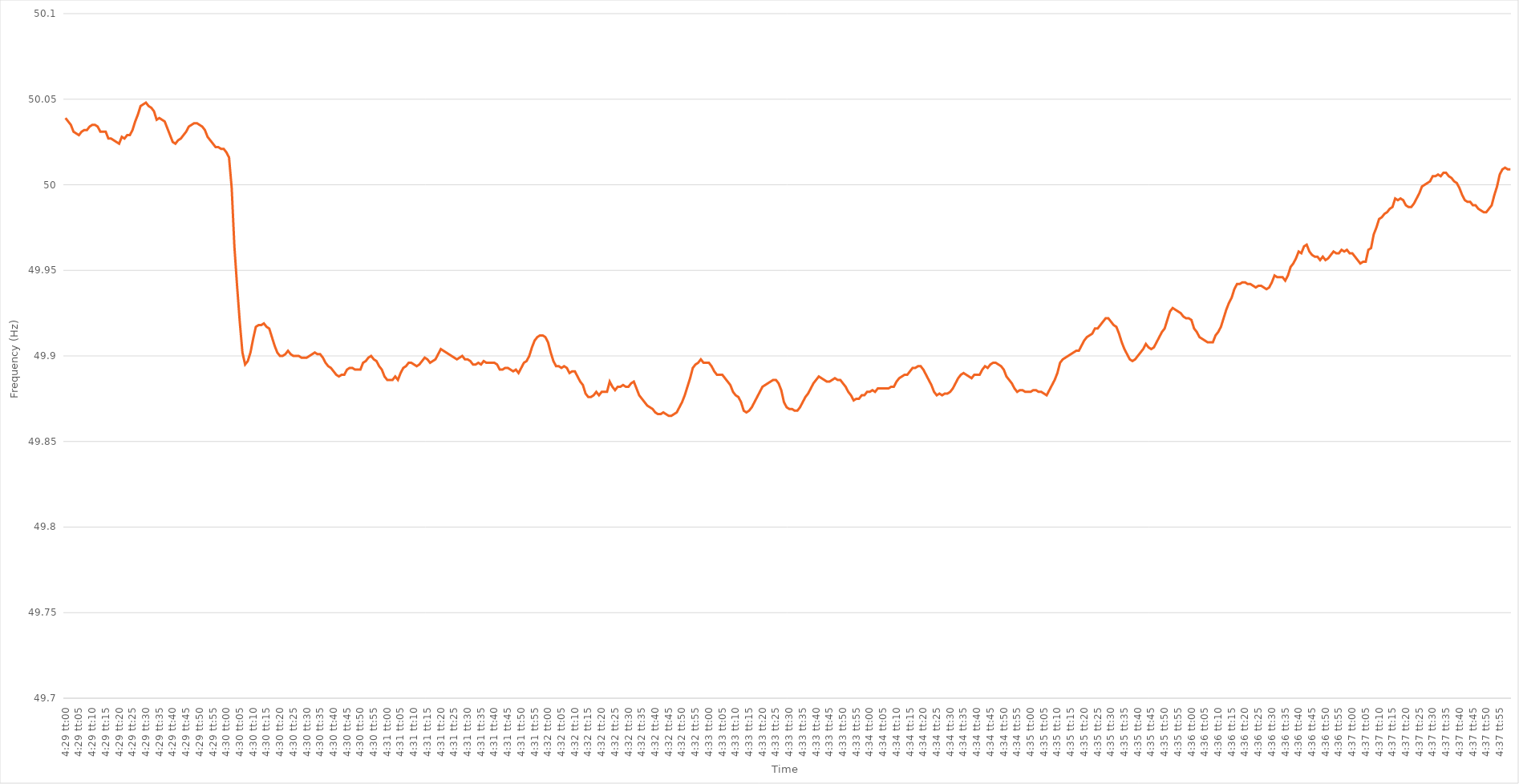
| Category | Series 0 |
|---|---|
| 0.18680555555555556 | 50.039 |
| 0.18681712962962962 | 50.037 |
| 0.18682870370370372 | 50.035 |
| 0.18684027777777779 | 50.031 |
| 0.18685185185185185 | 50.03 |
| 0.18686342592592595 | 50.029 |
| 0.186875 | 50.031 |
| 0.18688657407407408 | 50.032 |
| 0.18689814814814817 | 50.032 |
| 0.1869097222222222 | 50.034 |
| 0.18692129629629628 | 50.035 |
| 0.18693287037037035 | 50.035 |
| 0.18694444444444444 | 50.034 |
| 0.1869560185185185 | 50.031 |
| 0.18696759259259257 | 50.031 |
| 0.18697916666666667 | 50.031 |
| 0.18699074074074074 | 50.027 |
| 0.1870023148148148 | 50.027 |
| 0.1870138888888889 | 50.026 |
| 0.18702546296296296 | 50.025 |
| 0.18703703703703703 | 50.024 |
| 0.18704861111111112 | 50.028 |
| 0.1870601851851852 | 50.027 |
| 0.18707175925925926 | 50.029 |
| 0.18708333333333335 | 50.029 |
| 0.18709490740740742 | 50.032 |
| 0.18710648148148148 | 50.037 |
| 0.18711805555555558 | 50.041 |
| 0.18712962962962965 | 50.046 |
| 0.1871412037037037 | 50.047 |
| 0.18715277777777775 | 50.048 |
| 0.18716435185185185 | 50.046 |
| 0.1871759259259259 | 50.045 |
| 0.18718749999999998 | 50.043 |
| 0.18719907407407407 | 50.038 |
| 0.18721064814814814 | 50.039 |
| 0.1872222222222222 | 50.038 |
| 0.1872337962962963 | 50.037 |
| 0.18724537037037037 | 50.033 |
| 0.18725694444444443 | 50.029 |
| 0.18726851851851853 | 50.025 |
| 0.1872800925925926 | 50.024 |
| 0.18729166666666666 | 50.026 |
| 0.18730324074074076 | 50.027 |
| 0.18731481481481482 | 50.029 |
| 0.1873263888888889 | 50.031 |
| 0.18733796296296298 | 50.034 |
| 0.18734953703703705 | 50.035 |
| 0.18736111111111112 | 50.036 |
| 0.1873726851851852 | 50.036 |
| 0.18738425925925925 | 50.035 |
| 0.18739583333333332 | 50.034 |
| 0.18740740740740738 | 50.032 |
| 0.18741898148148148 | 50.028 |
| 0.18743055555555554 | 50.026 |
| 0.1874421296296296 | 50.024 |
| 0.1874537037037037 | 50.022 |
| 0.18746527777777777 | 50.022 |
| 0.18747685185185184 | 50.021 |
| 0.18748842592592593 | 50.021 |
| 0.1875 | 50.019 |
| 0.18751157407407407 | 50.016 |
| 0.18752314814814816 | 49.998 |
| 0.18753472222222223 | 49.964 |
| 0.1875462962962963 | 49.941 |
| 0.1875578703703704 | 49.92 |
| 0.18756944444444446 | 49.902 |
| 0.18758101851851852 | 49.895 |
| 0.18759259259259262 | 49.897 |
| 0.18760416666666666 | 49.902 |
| 0.18761574074074075 | 49.91 |
| 0.1876273148148148 | 49.917 |
| 0.18763888888888888 | 49.918 |
| 0.18765046296296295 | 49.918 |
| 0.18766203703703702 | 49.919 |
| 0.1876736111111111 | 49.917 |
| 0.18768518518518518 | 49.916 |
| 0.18769675925925924 | 49.911 |
| 0.18770833333333334 | 49.906 |
| 0.1877199074074074 | 49.902 |
| 0.18773148148148147 | 49.9 |
| 0.18774305555555557 | 49.9 |
| 0.18775462962962963 | 49.901 |
| 0.1877662037037037 | 49.903 |
| 0.1877777777777778 | 49.901 |
| 0.18778935185185186 | 49.9 |
| 0.18780092592592593 | 49.9 |
| 0.18781250000000002 | 49.9 |
| 0.1878240740740741 | 49.899 |
| 0.18783564814814815 | 49.899 |
| 0.1878472222222222 | 49.899 |
| 0.18785879629629632 | 49.9 |
| 0.18787037037037035 | 49.901 |
| 0.18788194444444442 | 49.902 |
| 0.18789351851851852 | 49.901 |
| 0.18790509259259258 | 49.901 |
| 0.18791666666666665 | 49.899 |
| 0.18792824074074074 | 49.896 |
| 0.1879398148148148 | 49.894 |
| 0.18795138888888888 | 49.893 |
| 0.18796296296296297 | 49.891 |
| 0.18797453703703704 | 49.889 |
| 0.1879861111111111 | 49.888 |
| 0.1879976851851852 | 49.889 |
| 0.18800925925925926 | 49.889 |
| 0.18802083333333333 | 49.892 |
| 0.18803240740740743 | 49.893 |
| 0.1880439814814815 | 49.893 |
| 0.18805555555555556 | 49.892 |
| 0.18806712962962965 | 49.892 |
| 0.18807870370370372 | 49.892 |
| 0.18809027777777776 | 49.896 |
| 0.18810185185185188 | 49.897 |
| 0.18811342592592592 | 49.899 |
| 0.188125 | 49.9 |
| 0.18813657407407405 | 49.898 |
| 0.18814814814814815 | 49.897 |
| 0.18815972222222221 | 49.894 |
| 0.18817129629629628 | 49.892 |
| 0.18818287037037038 | 49.888 |
| 0.18819444444444444 | 49.886 |
| 0.1882060185185185 | 49.886 |
| 0.1882175925925926 | 49.886 |
| 0.18822916666666667 | 49.888 |
| 0.18824074074074074 | 49.886 |
| 0.18825231481481483 | 49.89 |
| 0.1882638888888889 | 49.893 |
| 0.18827546296296296 | 49.894 |
| 0.18828703703703706 | 49.896 |
| 0.18829861111111112 | 49.896 |
| 0.1883101851851852 | 49.895 |
| 0.18832175925925929 | 49.894 |
| 0.18833333333333332 | 49.895 |
| 0.1883449074074074 | 49.897 |
| 0.18835648148148146 | 49.899 |
| 0.18836805555555555 | 49.898 |
| 0.18837962962962962 | 49.896 |
| 0.18839120370370369 | 49.897 |
| 0.18840277777777778 | 49.898 |
| 0.18841435185185185 | 49.901 |
| 0.1884259259259259 | 49.904 |
| 0.1884375 | 49.903 |
| 0.18844907407407407 | 49.902 |
| 0.18846064814814814 | 49.901 |
| 0.18847222222222224 | 49.9 |
| 0.1884837962962963 | 49.899 |
| 0.18849537037037037 | 49.898 |
| 0.18850694444444446 | 49.899 |
| 0.18851851851851853 | 49.9 |
| 0.1885300925925926 | 49.898 |
| 0.1885416666666667 | 49.898 |
| 0.18855324074074073 | 49.897 |
| 0.18856481481481482 | 49.895 |
| 0.18857638888888886 | 49.895 |
| 0.18858796296296296 | 49.896 |
| 0.18859953703703702 | 49.895 |
| 0.1886111111111111 | 49.897 |
| 0.18862268518518518 | 49.896 |
| 0.18863425925925925 | 49.896 |
| 0.18864583333333332 | 49.896 |
| 0.1886574074074074 | 49.896 |
| 0.18866898148148148 | 49.895 |
| 0.18868055555555555 | 49.892 |
| 0.18869212962962964 | 49.892 |
| 0.1887037037037037 | 49.893 |
| 0.18871527777777777 | 49.893 |
| 0.18872685185185187 | 49.892 |
| 0.18873842592592593 | 49.891 |
| 0.18875 | 49.892 |
| 0.1887615740740741 | 49.89 |
| 0.18877314814814816 | 49.893 |
| 0.18878472222222223 | 49.896 |
| 0.18879629629629627 | 49.897 |
| 0.1888078703703704 | 49.9 |
| 0.18881944444444443 | 49.905 |
| 0.1888310185185185 | 49.909 |
| 0.1888425925925926 | 49.911 |
| 0.18885416666666666 | 49.912 |
| 0.18886574074074072 | 49.912 |
| 0.18887731481481482 | 49.911 |
| 0.18888888888888888 | 49.908 |
| 0.18890046296296295 | 49.902 |
| 0.18891203703703704 | 49.897 |
| 0.1889236111111111 | 49.894 |
| 0.18893518518518518 | 49.894 |
| 0.18894675925925927 | 49.893 |
| 0.18895833333333334 | 49.894 |
| 0.1889699074074074 | 49.893 |
| 0.1889814814814815 | 49.89 |
| 0.18899305555555557 | 49.891 |
| 0.18900462962962963 | 49.891 |
| 0.18901620370370367 | 49.888 |
| 0.1890277777777778 | 49.885 |
| 0.18903935185185183 | 49.883 |
| 0.18905092592592596 | 49.878 |
| 0.1890625 | 49.876 |
| 0.18907407407407406 | 49.876 |
| 0.18908564814814813 | 49.877 |
| 0.18909722222222222 | 49.879 |
| 0.1891087962962963 | 49.877 |
| 0.18912037037037036 | 49.879 |
| 0.18913194444444445 | 49.879 |
| 0.18914351851851852 | 49.879 |
| 0.18915509259259258 | 49.885 |
| 0.18916666666666668 | 49.882 |
| 0.18917824074074074 | 49.88 |
| 0.1891898148148148 | 49.882 |
| 0.1892013888888889 | 49.882 |
| 0.18921296296296297 | 49.883 |
| 0.18922453703703704 | 49.882 |
| 0.18923611111111113 | 49.882 |
| 0.1892476851851852 | 49.884 |
| 0.18925925925925924 | 49.885 |
| 0.18927083333333336 | 49.881 |
| 0.1892824074074074 | 49.877 |
| 0.1892939814814815 | 49.875 |
| 0.18930555555555553 | 49.873 |
| 0.18931712962962963 | 49.871 |
| 0.1893287037037037 | 49.87 |
| 0.18934027777777776 | 49.869 |
| 0.18935185185185185 | 49.867 |
| 0.18936342592592592 | 49.866 |
| 0.189375 | 49.866 |
| 0.18938657407407408 | 49.867 |
| 0.18939814814814815 | 49.866 |
| 0.18940972222222222 | 49.865 |
| 0.1894212962962963 | 49.865 |
| 0.18943287037037038 | 49.866 |
| 0.18944444444444444 | 49.867 |
| 0.18945601851851854 | 49.87 |
| 0.1894675925925926 | 49.873 |
| 0.18947916666666667 | 49.877 |
| 0.18949074074074077 | 49.882 |
| 0.1895023148148148 | 49.887 |
| 0.1895138888888889 | 49.893 |
| 0.18952546296296294 | 49.895 |
| 0.18953703703703703 | 49.896 |
| 0.1895486111111111 | 49.898 |
| 0.18956018518518516 | 49.896 |
| 0.18957175925925926 | 49.896 |
| 0.18958333333333333 | 49.896 |
| 0.1895949074074074 | 49.894 |
| 0.1896064814814815 | 49.891 |
| 0.18961805555555555 | 49.889 |
| 0.18962962962962962 | 49.889 |
| 0.18964120370370371 | 49.889 |
| 0.18965277777777778 | 49.887 |
| 0.18966435185185185 | 49.885 |
| 0.18967592592592594 | 49.883 |
| 0.1896875 | 49.879 |
| 0.18969907407407408 | 49.877 |
| 0.18971064814814817 | 49.876 |
| 0.18972222222222224 | 49.873 |
| 0.1897337962962963 | 49.868 |
| 0.18974537037037034 | 49.867 |
| 0.18975694444444446 | 49.868 |
| 0.1897685185185185 | 49.87 |
| 0.18978009259259257 | 49.873 |
| 0.18979166666666666 | 49.876 |
| 0.18980324074074073 | 49.879 |
| 0.1898148148148148 | 49.882 |
| 0.1898263888888889 | 49.883 |
| 0.18983796296296296 | 49.884 |
| 0.18984953703703702 | 49.885 |
| 0.18986111111111112 | 49.886 |
| 0.18987268518518519 | 49.886 |
| 0.18988425925925925 | 49.884 |
| 0.18989583333333335 | 49.88 |
| 0.1899074074074074 | 49.873 |
| 0.18991898148148148 | 49.87 |
| 0.18993055555555557 | 49.869 |
| 0.18994212962962964 | 49.869 |
| 0.1899537037037037 | 49.868 |
| 0.18996527777777775 | 49.868 |
| 0.18997685185185187 | 49.87 |
| 0.1899884259259259 | 49.873 |
| 0.19000000000000003 | 49.876 |
| 0.19001157407407407 | 49.878 |
| 0.19002314814814814 | 49.881 |
| 0.1900347222222222 | 49.884 |
| 0.1900462962962963 | 49.886 |
| 0.19005787037037036 | 49.888 |
| 0.19006944444444443 | 49.887 |
| 0.19008101851851852 | 49.886 |
| 0.1900925925925926 | 49.885 |
| 0.19010416666666666 | 49.885 |
| 0.19011574074074075 | 49.886 |
| 0.19012731481481482 | 49.887 |
| 0.19013888888888889 | 49.886 |
| 0.19015046296296298 | 49.886 |
| 0.19016203703703705 | 49.884 |
| 0.1901736111111111 | 49.882 |
| 0.1901851851851852 | 49.879 |
| 0.19019675925925927 | 49.877 |
| 0.1902083333333333 | 49.874 |
| 0.19021990740740743 | 49.875 |
| 0.19023148148148147 | 49.875 |
| 0.19024305555555557 | 49.877 |
| 0.1902546296296296 | 49.877 |
| 0.1902662037037037 | 49.879 |
| 0.19027777777777777 | 49.879 |
| 0.19028935185185183 | 49.88 |
| 0.19030092592592593 | 49.879 |
| 0.1903125 | 49.881 |
| 0.19032407407407406 | 49.881 |
| 0.19033564814814816 | 49.881 |
| 0.19034722222222222 | 49.881 |
| 0.1903587962962963 | 49.881 |
| 0.19037037037037038 | 49.882 |
| 0.19038194444444445 | 49.882 |
| 0.19039351851851852 | 49.885 |
| 0.1904050925925926 | 49.887 |
| 0.19041666666666668 | 49.888 |
| 0.19042824074074075 | 49.889 |
| 0.19043981481481484 | 49.889 |
| 0.19045138888888888 | 49.891 |
| 0.19046296296296297 | 49.893 |
| 0.190474537037037 | 49.893 |
| 0.1904861111111111 | 49.894 |
| 0.19049768518518517 | 49.894 |
| 0.19050925925925924 | 49.892 |
| 0.19052083333333333 | 49.889 |
| 0.1905324074074074 | 49.886 |
| 0.19054398148148147 | 49.883 |
| 0.19055555555555556 | 49.879 |
| 0.19056712962962963 | 49.877 |
| 0.1905787037037037 | 49.878 |
| 0.1905902777777778 | 49.877 |
| 0.19060185185185186 | 49.878 |
| 0.19061342592592592 | 49.878 |
| 0.19062500000000002 | 49.879 |
| 0.19063657407407408 | 49.881 |
| 0.19064814814814815 | 49.884 |
| 0.19065972222222224 | 49.887 |
| 0.1906712962962963 | 49.889 |
| 0.19068287037037038 | 49.89 |
| 0.19069444444444442 | 49.889 |
| 0.19070601851851854 | 49.888 |
| 0.19071759259259258 | 49.887 |
| 0.19072916666666664 | 49.889 |
| 0.19074074074074074 | 49.889 |
| 0.1907523148148148 | 49.889 |
| 0.19076388888888887 | 49.892 |
| 0.19077546296296297 | 49.894 |
| 0.19078703703703703 | 49.893 |
| 0.1907986111111111 | 49.895 |
| 0.1908101851851852 | 49.896 |
| 0.19082175925925926 | 49.896 |
| 0.19083333333333333 | 49.895 |
| 0.19084490740740742 | 49.894 |
| 0.1908564814814815 | 49.892 |
| 0.19086805555555555 | 49.888 |
| 0.19087962962962965 | 49.886 |
| 0.19089120370370372 | 49.884 |
| 0.19090277777777778 | 49.881 |
| 0.19091435185185182 | 49.879 |
| 0.19092592592592594 | 49.88 |
| 0.19093749999999998 | 49.88 |
| 0.1909490740740741 | 49.879 |
| 0.19096064814814814 | 49.879 |
| 0.1909722222222222 | 49.879 |
| 0.19098379629629628 | 49.88 |
| 0.19099537037037037 | 49.88 |
| 0.19100694444444444 | 49.879 |
| 0.1910185185185185 | 49.879 |
| 0.1910300925925926 | 49.878 |
| 0.19104166666666667 | 49.877 |
| 0.19105324074074073 | 49.88 |
| 0.19106481481481483 | 49.883 |
| 0.1910763888888889 | 49.886 |
| 0.19108796296296296 | 49.89 |
| 0.19109953703703705 | 49.896 |
| 0.19111111111111112 | 49.898 |
| 0.1911226851851852 | 49.899 |
| 0.19113425925925928 | 49.9 |
| 0.19114583333333335 | 49.901 |
| 0.1911574074074074 | 49.902 |
| 0.1911689814814815 | 49.903 |
| 0.19118055555555555 | 49.903 |
| 0.19119212962962964 | 49.906 |
| 0.19120370370370368 | 49.909 |
| 0.19121527777777778 | 49.911 |
| 0.19122685185185184 | 49.912 |
| 0.1912384259259259 | 49.913 |
| 0.19125 | 49.916 |
| 0.19126157407407407 | 49.916 |
| 0.19127314814814814 | 49.918 |
| 0.19128472222222223 | 49.92 |
| 0.1912962962962963 | 49.922 |
| 0.19130787037037036 | 49.922 |
| 0.19131944444444446 | 49.92 |
| 0.19133101851851853 | 49.918 |
| 0.1913425925925926 | 49.917 |
| 0.1913541666666667 | 49.913 |
| 0.19136574074074075 | 49.908 |
| 0.19137731481481482 | 49.904 |
| 0.19138888888888891 | 49.901 |
| 0.19140046296296295 | 49.898 |
| 0.19141203703703705 | 49.897 |
| 0.19142361111111109 | 49.898 |
| 0.19143518518518518 | 49.9 |
| 0.19144675925925925 | 49.902 |
| 0.1914583333333333 | 49.904 |
| 0.1914699074074074 | 49.907 |
| 0.19148148148148147 | 49.905 |
| 0.19149305555555554 | 49.904 |
| 0.19150462962962964 | 49.905 |
| 0.1915162037037037 | 49.908 |
| 0.19152777777777777 | 49.911 |
| 0.19153935185185186 | 49.914 |
| 0.19155092592592593 | 49.916 |
| 0.1915625 | 49.921 |
| 0.1915740740740741 | 49.926 |
| 0.19158564814814816 | 49.928 |
| 0.19159722222222222 | 49.927 |
| 0.19160879629629632 | 49.926 |
| 0.19162037037037036 | 49.925 |
| 0.19163194444444445 | 49.923 |
| 0.1916435185185185 | 49.922 |
| 0.1916550925925926 | 49.922 |
| 0.19166666666666665 | 49.921 |
| 0.19167824074074072 | 49.916 |
| 0.1916898148148148 | 49.914 |
| 0.19170138888888888 | 49.911 |
| 0.19171296296296295 | 49.91 |
| 0.19172453703703704 | 49.909 |
| 0.1917361111111111 | 49.908 |
| 0.19174768518518517 | 49.908 |
| 0.19175925925925927 | 49.908 |
| 0.19177083333333333 | 49.912 |
| 0.1917824074074074 | 49.914 |
| 0.1917939814814815 | 49.917 |
| 0.19180555555555556 | 49.922 |
| 0.19181712962962963 | 49.927 |
| 0.19182870370370372 | 49.931 |
| 0.1918402777777778 | 49.934 |
| 0.19185185185185186 | 49.939 |
| 0.1918634259259259 | 49.942 |
| 0.19187500000000002 | 49.942 |
| 0.19188657407407406 | 49.943 |
| 0.19189814814814818 | 49.943 |
| 0.19190972222222222 | 49.942 |
| 0.19192129629629628 | 49.942 |
| 0.19193287037037035 | 49.941 |
| 0.19194444444444445 | 49.94 |
| 0.1919560185185185 | 49.941 |
| 0.19196759259259258 | 49.941 |
| 0.19197916666666667 | 49.94 |
| 0.19199074074074074 | 49.939 |
| 0.1920023148148148 | 49.94 |
| 0.1920138888888889 | 49.943 |
| 0.19202546296296297 | 49.947 |
| 0.19203703703703703 | 49.946 |
| 0.19204861111111113 | 49.946 |
| 0.1920601851851852 | 49.946 |
| 0.19207175925925926 | 49.944 |
| 0.19208333333333336 | 49.947 |
| 0.19209490740740742 | 49.952 |
| 0.19210648148148146 | 49.954 |
| 0.19211805555555558 | 49.957 |
| 0.19212962962962962 | 49.961 |
| 0.1921412037037037 | 49.96 |
| 0.19215277777777776 | 49.964 |
| 0.19216435185185185 | 49.965 |
| 0.19217592592592592 | 49.961 |
| 0.19218749999999998 | 49.959 |
| 0.19219907407407408 | 49.958 |
| 0.19221064814814814 | 49.958 |
| 0.1922222222222222 | 49.956 |
| 0.1922337962962963 | 49.958 |
| 0.19224537037037037 | 49.956 |
| 0.19225694444444444 | 49.957 |
| 0.19226851851851853 | 49.959 |
| 0.1922800925925926 | 49.961 |
| 0.19229166666666667 | 49.96 |
| 0.19230324074074076 | 49.96 |
| 0.19231481481481483 | 49.962 |
| 0.1923263888888889 | 49.961 |
| 0.192337962962963 | 49.962 |
| 0.19234953703703703 | 49.96 |
| 0.19236111111111112 | 49.96 |
| 0.19237268518518516 | 49.958 |
| 0.19238425925925925 | 49.956 |
| 0.19239583333333332 | 49.954 |
| 0.1924074074074074 | 49.955 |
| 0.19241898148148148 | 49.955 |
| 0.19243055555555555 | 49.962 |
| 0.19244212962962962 | 49.963 |
| 0.1924537037037037 | 49.971 |
| 0.19246527777777778 | 49.975 |
| 0.19247685185185184 | 49.98 |
| 0.19248842592592594 | 49.981 |
| 0.1925 | 49.983 |
| 0.19251157407407407 | 49.984 |
| 0.19252314814814817 | 49.986 |
| 0.19253472222222223 | 49.987 |
| 0.1925462962962963 | 49.992 |
| 0.1925578703703704 | 49.991 |
| 0.19256944444444443 | 49.992 |
| 0.19258101851851853 | 49.991 |
| 0.19259259259259257 | 49.988 |
| 0.1926041666666667 | 49.987 |
| 0.19261574074074073 | 49.987 |
| 0.1926273148148148 | 49.989 |
| 0.1926388888888889 | 49.992 |
| 0.19265046296296295 | 49.995 |
| 0.19266203703703702 | 49.999 |
| 0.19267361111111111 | 50 |
| 0.19268518518518518 | 50.001 |
| 0.19269675925925925 | 50.002 |
| 0.19270833333333334 | 50.005 |
| 0.1927199074074074 | 50.005 |
| 0.19273148148148148 | 50.006 |
| 0.19274305555555557 | 50.005 |
| 0.19275462962962964 | 50.007 |
| 0.1927662037037037 | 50.007 |
| 0.1927777777777778 | 50.005 |
| 0.19278935185185186 | 50.004 |
| 0.19280092592592593 | 50.002 |
| 0.19281249999999997 | 50.001 |
| 0.1928240740740741 | 49.998 |
| 0.19283564814814813 | 49.994 |
| 0.19284722222222225 | 49.991 |
| 0.1928587962962963 | 49.99 |
| 0.19287037037037036 | 49.99 |
| 0.19288194444444443 | 49.988 |
| 0.19289351851851852 | 49.988 |
| 0.1929050925925926 | 49.986 |
| 0.19291666666666665 | 49.985 |
| 0.19292824074074075 | 49.984 |
| 0.19293981481481481 | 49.984 |
| 0.19295138888888888 | 49.986 |
| 0.19296296296296298 | 49.988 |
| 0.19297453703703704 | 49.994 |
| 0.1929861111111111 | 49.999 |
| 0.1929976851851852 | 50.006 |
| 0.19300925925925927 | 50.009 |
| 0.19302083333333334 | 50.01 |
| 0.19303240740740743 | 50.009 |
| 0.1930439814814815 | 50.009 |